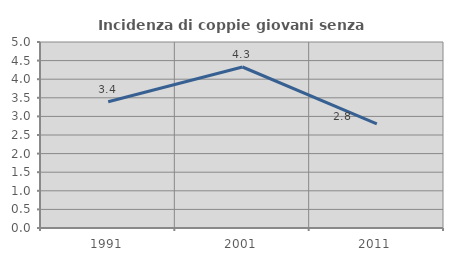
| Category | Incidenza di coppie giovani senza figli |
|---|---|
| 1991.0 | 3.394 |
| 2001.0 | 4.328 |
| 2011.0 | 2.801 |